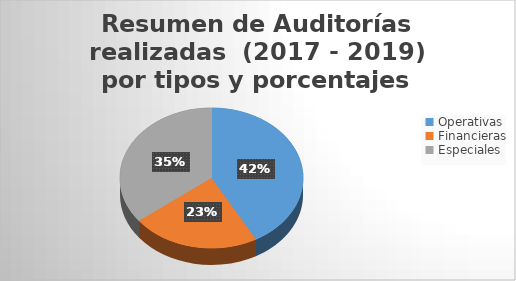
| Category | Series 0 |
|---|---|
| Operativas | 26 |
| Financieras | 14 |
| Especiales | 22 |